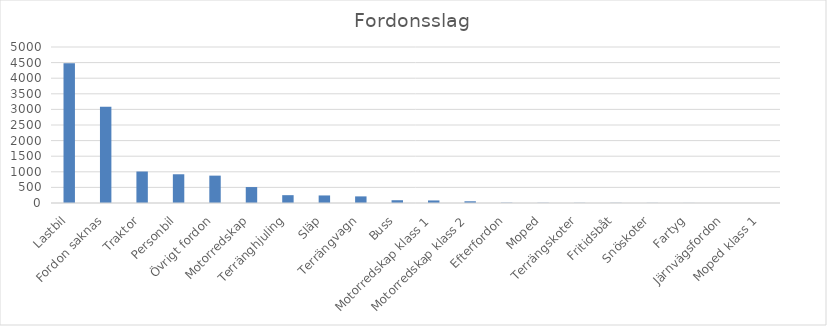
| Category | Summa |
|---|---|
| Lastbil | 4482 |
| Fordon saknas | 3085 |
| Traktor | 1009 |
| Personbil | 921 |
| Övrigt fordon | 877 |
| Motorredskap | 511 |
| Terränghjuling | 251 |
| Släp | 242 |
| Terrängvagn | 212 |
| Buss | 89 |
| Motorredskap klass 1 | 82 |
| Motorredskap klass 2 | 55 |
| Efterfordon | 9 |
| Moped | 6 |
| Terrängskoter | 5 |
| Fritidsbåt | 5 |
| Snöskoter | 4 |
| Fartyg | 2 |
| Järnvägsfordon | 1 |
| Moped klass 1 | 1 |